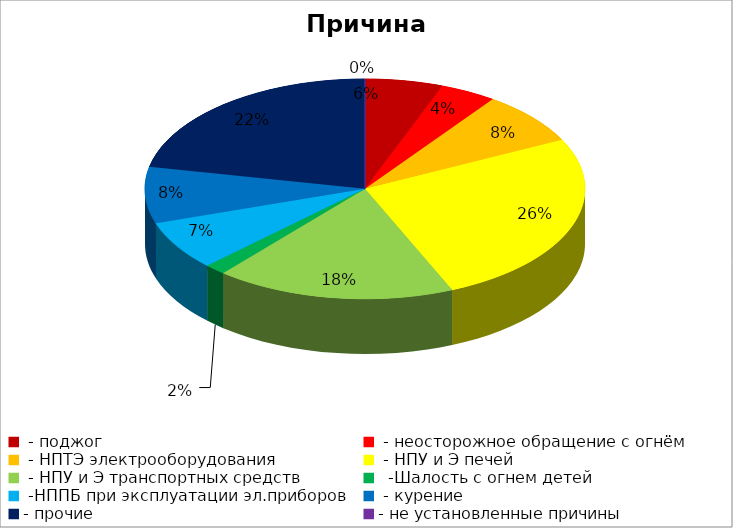
| Category | Причина пожара |
|---|---|
|  - поджог | 11 |
|  - неосторожное обращение с огнём | 8 |
|  - НПТЭ электрооборудования | 15 |
|  - НПУ и Э печей | 50 |
|  - НПУ и Э транспортных средств | 34 |
|   -Шалость с огнем детей | 3 |
|  -НППБ при эксплуатации эл.приборов | 14 |
|  - курение | 16 |
| - прочие | 42 |
| - не установленные причины | 0 |